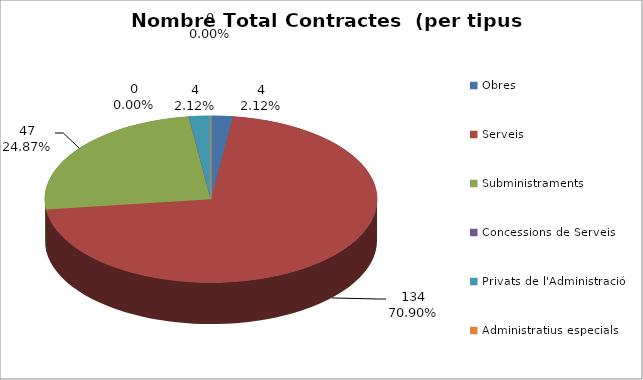
| Category | Nombre Total Contractes |
|---|---|
| Obres | 4 |
| Serveis | 134 |
| Subministraments | 47 |
| Concessions de Serveis | 0 |
| Privats de l'Administració | 4 |
| Administratius especials | 0 |